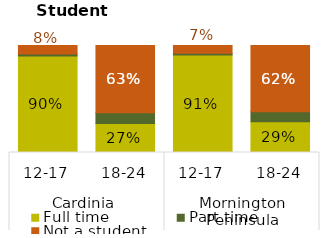
| Category | Full time | Part time | Not a student |
|---|---|---|---|
| 0 | 0.903 | 0.018 | 0.079 |
| 1 | 0.271 | 0.101 | 0.628 |
| 2 | 0.912 | 0.017 | 0.072 |
| 3 | 0.287 | 0.094 | 0.619 |